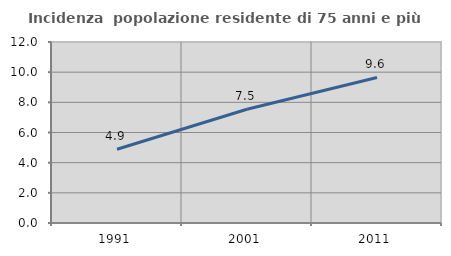
| Category | Incidenza  popolazione residente di 75 anni e più |
|---|---|
| 1991.0 | 4.893 |
| 2001.0 | 7.541 |
| 2011.0 | 9.65 |